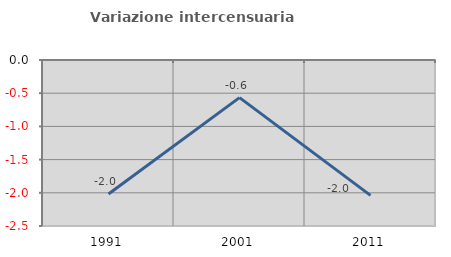
| Category | Variazione intercensuaria annua |
|---|---|
| 1991.0 | -2.018 |
| 2001.0 | -0.567 |
| 2011.0 | -2.039 |